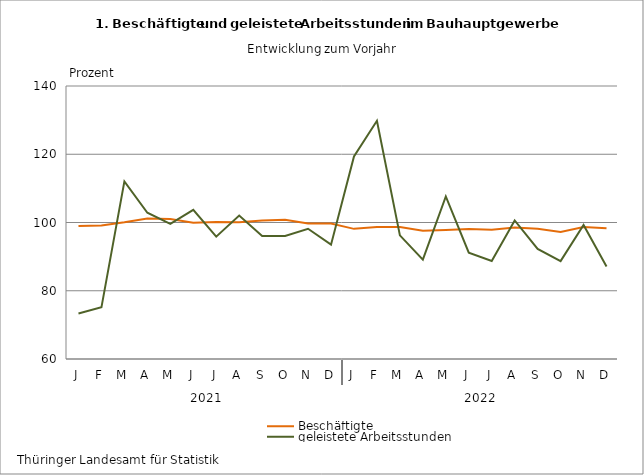
| Category | Beschäftigte | geleistete Arbeitsstunden |
|---|---|---|
| J | 98.957 | 73.355 |
| F | 99.144 | 75.145 |
| M | 100.063 | 112.039 |
| A | 101.165 | 102.859 |
| M | 100.998 | 99.625 |
| J | 99.917 | 103.729 |
| J | 100.166 | 95.854 |
| A | 100.095 | 102.019 |
| S | 100.569 | 96.039 |
| O | 100.783 | 96.077 |
| N | 99.71 | 98.17 |
| D | 99.707 | 93.499 |
| J | 98.136 | 119.359 |
| F | 98.653 | 129.807 |
| M | 98.666 | 96.224 |
| A | 97.608 | 89.122 |
| M | 97.796 | 107.626 |
| J | 98.066 | 91.145 |
| J | 97.865 | 88.706 |
| A | 98.556 | 100.602 |
| S | 98.14 | 92.251 |
| O | 97.193 | 88.697 |
| N | 98.707 | 99.281 |
| D | 98.344 | 87.107 |